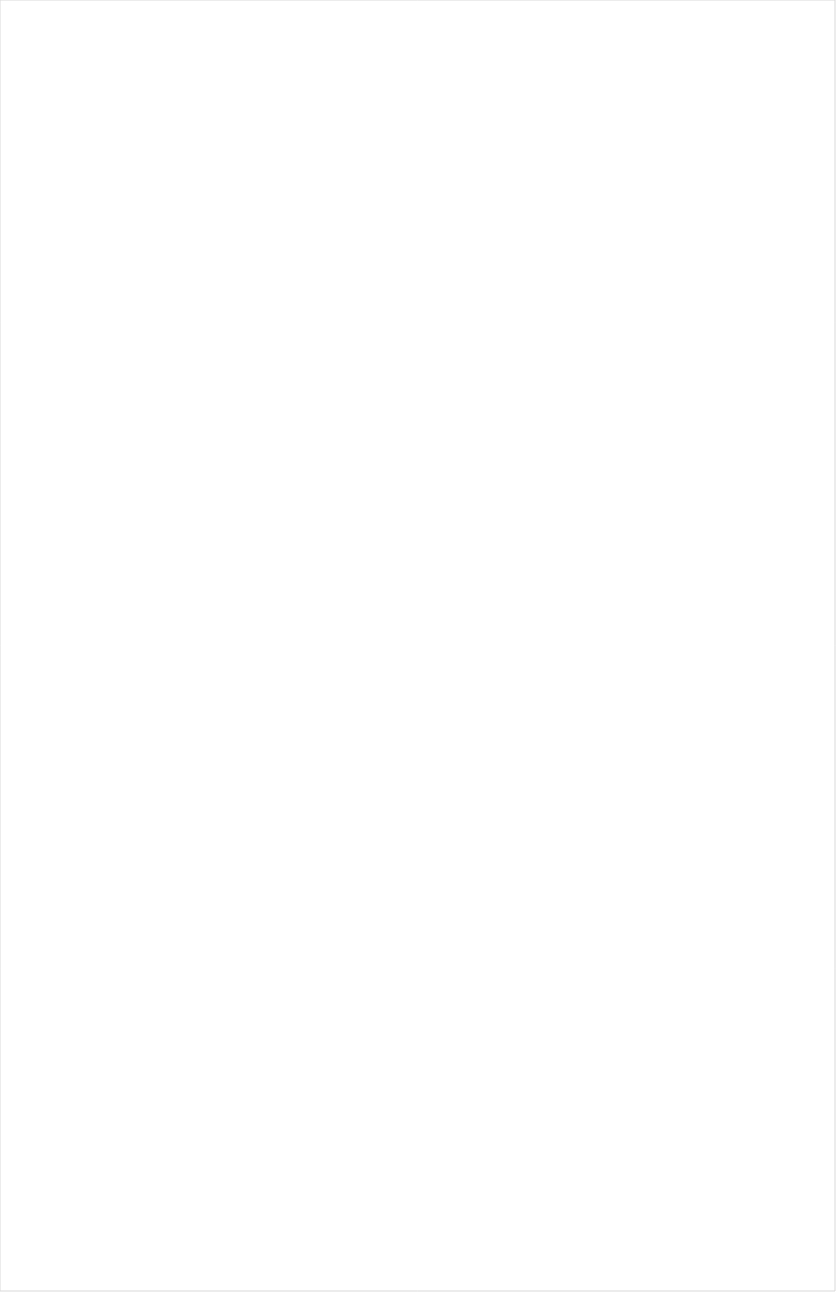
| Category | Total |
|---|---|
| Nick Toons | -0.245 |
| TUDN | -0.242 |
| Cartoon Network | -0.234 |
| Teen Nick | -0.216 |
| Nick Jr. | -0.199 |
| Disney Channel | -0.195 |
| Telemundo | -0.189 |
| MTV2 | -0.184 |
| Disney Junior US | -0.18 |
| Univision | -0.179 |
| VH1 | -0.175 |
| Disney XD | -0.173 |
| Nick | -0.172 |
| UniMas | -0.156 |
| Galavision | -0.154 |
| Nick@Nite | -0.152 |
| MTV | -0.152 |
| Adult Swim | -0.151 |
| BET | -0.141 |
| ESPN Deportes | -0.136 |
| Comedy Central | -0.135 |
| NBC Universo | -0.131 |
| Universal Kids | -0.127 |
| Freeform | -0.122 |
| TV ONE | -0.118 |
| FXX | -0.106 |
| ESPN2 | -0.094 |
| Viceland | -0.09 |
| ESPN | -0.087 |
| NBA TV | -0.085 |
| PAC-12 Network | -0.077 |
| ESPNEWS | -0.067 |
| BRAVO | -0.065 |
| FX | -0.063 |
| FX Movie Channel | -0.059 |
| SYFY | -0.053 |
| ESPNU | -0.051 |
| E! | -0.049 |
| BET Her | -0.044 |
| Lifetime Movies | -0.042 |
| A&E | -0.042 |
| Lifetime | -0.041 |
| NFL Network | -0.038 |
| Discovery Family Channel | -0.033 |
| TLC | -0.027 |
| Independent Film (IFC) | -0.026 |
| Paramount Network | -0.023 |
| Logo | -0.019 |
| Cooking Channel | -0.015 |
| TBS | -0.013 |
| WE TV | -0.013 |
| Food Network | -0.013 |
| CMTV | -0.012 |
| USA Network | -0.009 |
| Discovery Channel | -0.005 |
| truTV | -0.005 |
| TNT | -0.004 |
| Reelz Channel | 0 |
| Travel | 0.001 |
| Destination America | 0.003 |
| FOX | 0.006 |
| AMC | 0.007 |
| FOX Sports 2 | 0.009 |
| MLB Network | 0.012 |
| NHL | 0.013 |
| Oprah Winfrey Network | 0.013 |
| Investigation Discovery | 0.02 |
| BBC America | 0.02 |
| POP | 0.023 |
| Big Ten Network | 0.024 |
| Ovation | 0.024 |
| OXYGEN | 0.025 |
| CNBC | 0.026 |
| Motor Trend Network | 0.027 |
| Discovery Life Channel | 0.029 |
| Olympic Channel | 0.031 |
| CW | 0.035 |
| Headline News | 0.037 |
| NBC Sports | 0.04 |
| FYI | 0.042 |
| Fox Sports 1 | 0.044 |
| Animal Planet | 0.046 |
| Golf | 0.049 |
| The Sportsman Channel | 0.049 |
| National Geographic | 0.051 |
| ION | 0.059 |
| DIY | 0.06 |
| HGTV | 0.06 |
| FXDEP | 0.061 |
| ABC | 0.064 |
| Game Show | 0.065 |
| History Channel | 0.066 |
| MyNetworkTV | 0.074 |
| CBS Sports | 0.077 |
| WGN America | 0.077 |
| TV LAND | 0.08 |
| NBC | 0.084 |
| CNN | 0.084 |
| Great American Country | 0.088 |
| American Heroes Channel | 0.089 |
| UP TV | 0.089 |
| Science Channel | 0.096 |
| National Geographic Wild | 0.096 |
| Outdoor Channel | 0.111 |
| Bloomberg HD | 0.112 |
| Weather Channel | 0.116 |
| CBS | 0.137 |
| Smithsonian | 0.15 |
| Hallmark | 0.156 |
| Fox News | 0.163 |
| SundanceTV | 0.164 |
| Tennis Channel | 0.168 |
| MSNBC | 0.203 |
| INSP | 0.222 |
| PBS | 0.229 |
| Hallmark Movies & Mysteries | 0.241 |
| Fox Business | 0.253 |
| RFD TV | 0.255 |